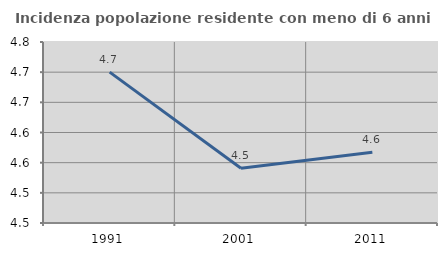
| Category | Incidenza popolazione residente con meno di 6 anni |
|---|---|
| 1991.0 | 4.7 |
| 2001.0 | 4.541 |
| 2011.0 | 4.567 |